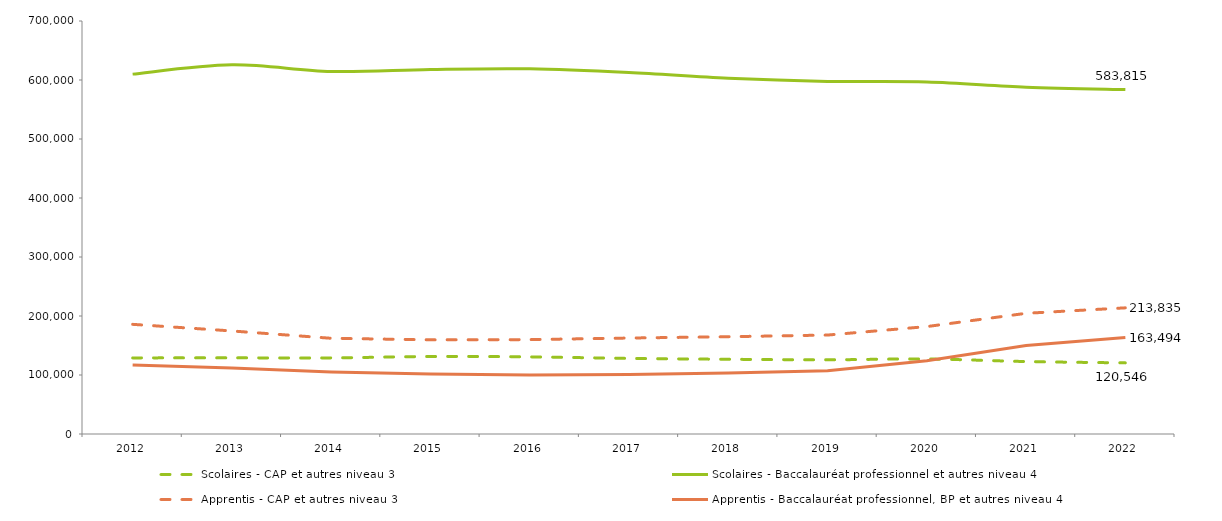
| Category | Scolaires - CAP et autres niveau 3  | Scolaires - Baccalauréat professionnel et autres niveau 4 | Apprentis - CAP et autres niveau 3  | Apprentis - Baccalauréat professionnel, BP et autres niveau 4 |
|---|---|---|---|---|
| 2012.0 | 128987 | 609954 | 185875 | 116897 |
| 2013.0 | 129093 | 625687 | 174654 | 111682 |
| 2014.0 | 129022 | 614415 | 162226 | 104880 |
| 2015.0 | 131367 | 617883 | 159610 | 101582 |
| 2016.0 | 130723 | 618884 | 159998 | 99814 |
| 2017.0 | 128139 | 612717 | 162650 | 100952 |
| 2018.0 | 126656 | 602969 | 164874 | 103453 |
| 2019.0 | 125773 | 597665 | 167702 | 107255 |
| 2020.0 | 127117 | 596569 | 182068 | 124236 |
| 2021.0 | 122806 | 587910 | 204575 | 149859 |
| 2022.0 | 120546 | 583815 | 213835 | 163494 |